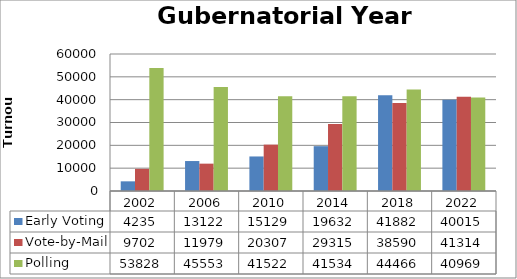
| Category | Early Voting | Vote-by-Mail | Polling |
|---|---|---|---|
| 2002.0 | 4235 | 9702 | 53828 |
| 2006.0 | 13122 | 11979 | 45553 |
| 2010.0 | 15129 | 20307 | 41522 |
| 2014.0 | 19632 | 29315 | 41534 |
| 2018.0 | 41882 | 38590 | 44466 |
| 2022.0 | 40015 | 41314 | 40969 |